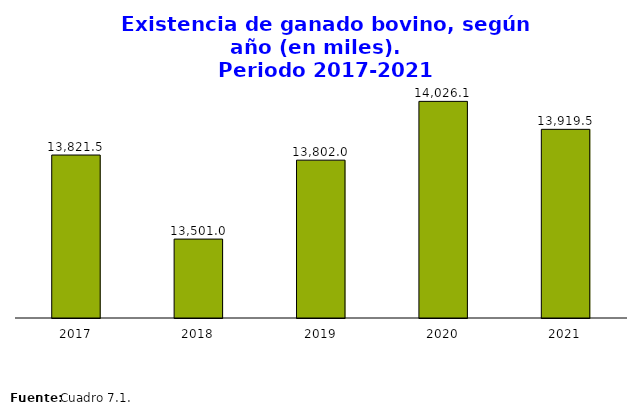
| Category | Total |
|---|---|
| 2017.0 | 13821.5 |
| 2018.0 | 13500.965 |
| 2019.0 | 13801.993 |
| 2020.0 | 14026.143 |
| 2021.0 | 13919.507 |